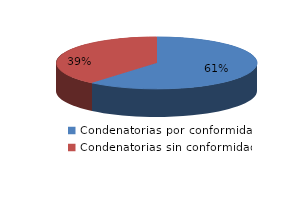
| Category | Series 0 |
|---|---|
| 0 | 80 |
| 1 | 51 |